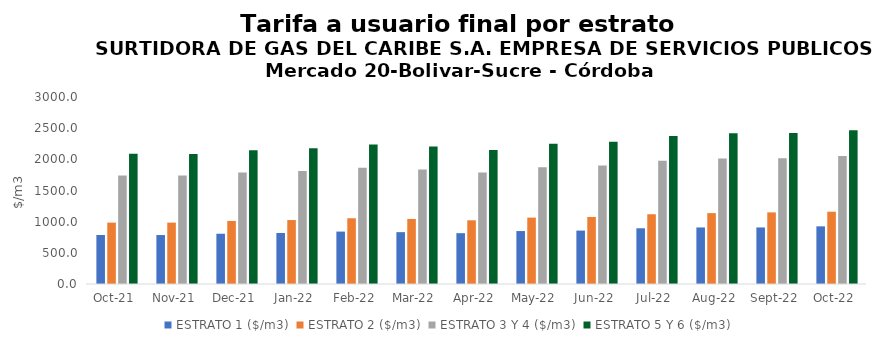
| Category | ESTRATO 1 ($/m3) | ESTRATO 2 ($/m3) | ESTRATO 3 Y 4 ($/m3) | ESTRATO 5 Y 6 ($/m3) |
|---|---|---|---|---|
| 2021-10-01 | 785.66 | 984.81 | 1740.51 | 2088.612 |
| 2021-11-01 | 785.55 | 984.37 | 1739.24 | 2087.088 |
| 2021-12-01 | 806.47 | 1011.33 | 1789.2 | 2147.04 |
| 2022-01-01 | 818.77 | 1026.2 | 1814.11 | 2176.932 |
| 2022-02-01 | 840.84 | 1054.98 | 1864.59 | 2237.508 |
| 2022-03-01 | 831.68 | 1043.33 | 1838.57 | 2206.284 |
| 2022-04-01 | 815.29 | 1022.06 | 1790.68 | 2148.816 |
| 2022-05-01 | 849.49 | 1064.9 | 1874.06 | 2248.872 |
| 2022-06-01 | 856.82 | 1075.55 | 1900.19 | 2280.228 |
| 2022-07-01 | 894.13 | 1119.13 | 1978.46 | 2374.152 |
| 2022-08-01 | 907.16 | 1137.37 | 2014.17 | 2417.004 |
| 2022-09-01 | 907.44 | 1149 | 2018.96 | 2422.752 |
| 2022-10-01 | 924.96 | 1159.68 | 2054.17 | 2465.004 |